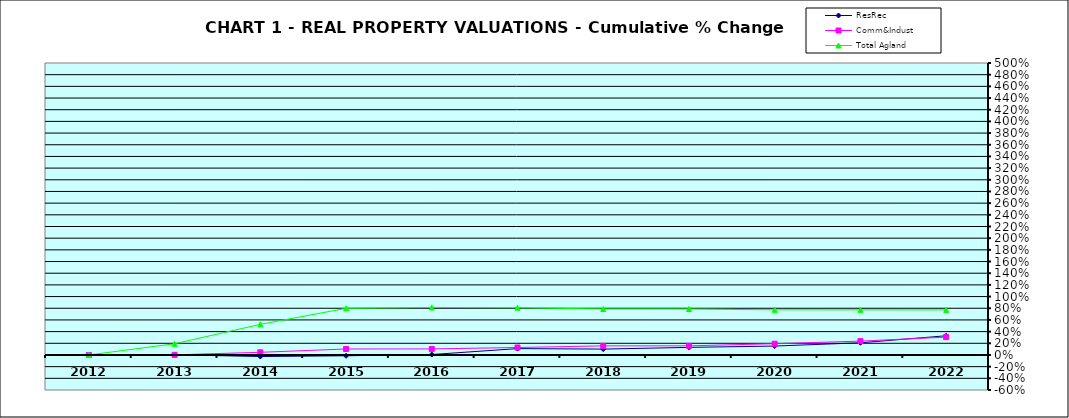
| Category | ResRec | Comm&Indust | Total Agland |
|---|---|---|---|
| 2012.0 | 0 | 0 | 0 |
| 2013.0 | 0.004 | 0.002 | 0.191 |
| 2014.0 | -0.027 | 0.046 | 0.524 |
| 2015.0 | -0.014 | 0.102 | 0.798 |
| 2016.0 | 0.008 | 0.103 | 0.814 |
| 2017.0 | 0.109 | 0.128 | 0.809 |
| 2018.0 | 0.101 | 0.156 | 0.787 |
| 2019.0 | 0.13 | 0.156 | 0.787 |
| 2020.0 | 0.153 | 0.193 | 0.773 |
| 2021.0 | 0.209 | 0.237 | 0.772 |
| 2022.0 | 0.329 | 0.306 | 0.772 |